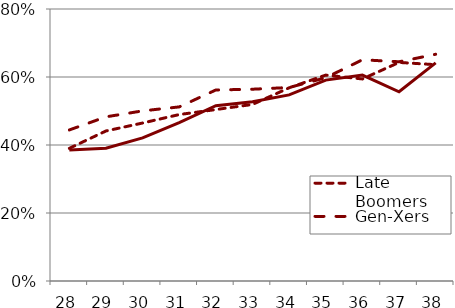
| Category | Late Boomers | Gen-Xers | Millennials |
|---|---|---|---|
| 28.0 | 0.39 | 0.444 | 0.385 |
| 29.0 | 0.441 | 0.483 | 0.391 |
| 30.0 | 0.465 | 0.5 | 0.421 |
| 31.0 | 0.49 | 0.512 | 0.466 |
| 32.0 | 0.504 | 0.562 | 0.516 |
| 33.0 | 0.519 | 0.564 | 0.527 |
| 34.0 | 0.568 | 0.569 | 0.547 |
| 35.0 | 0.606 | 0.598 | 0.591 |
| 36.0 | 0.594 | 0.651 | 0.606 |
| 37.0 | 0.643 | 0.645 | 0.557 |
| 38.0 | 0.636 | 0.667 | 0.642 |